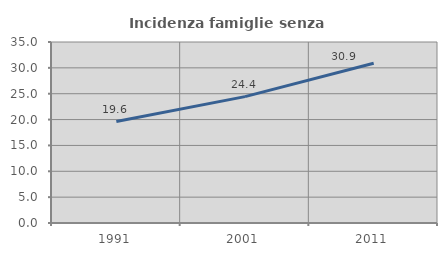
| Category | Incidenza famiglie senza nuclei |
|---|---|
| 1991.0 | 19.62 |
| 2001.0 | 24.433 |
| 2011.0 | 30.878 |